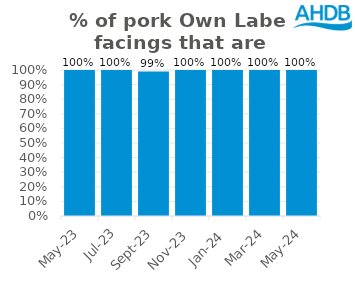
| Category | Pork |
|---|---|
| 2023-05-01 | 1 |
| 2023-07-01 | 1 |
| 2023-09-01 | 0.99 |
| 2023-11-01 | 1 |
| 2024-01-01 | 1 |
| 2024-03-01 | 1 |
| 2024-05-01 | 1 |